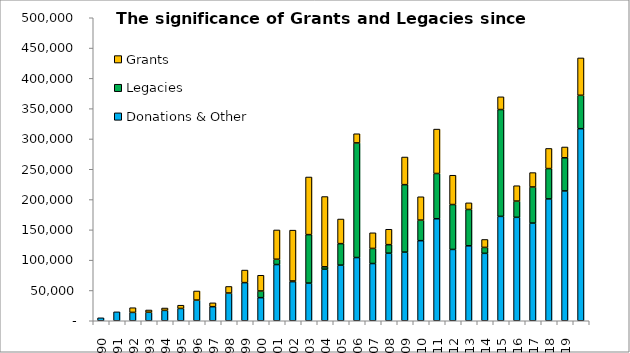
| Category | Donations & Other Income  | Legacies  | Grants |
|---|---|---|---|
| 1990.0 | 4873 | 0 | 0 |
| 1991.0 | 14704 | 0 | 0 |
| 1992.0 | 13769 | 0 | 7740 |
| 1993.0 | 14069 | 0 | 3720 |
| 1994.0 | 17131 | 0 | 3900 |
| 1995.0 | 20295 | 0 | 5375 |
| 1996.0 | 34104 | 0 | 15025 |
| 1997.0 | 23215 | 0 | 6350 |
| 1998.0 | 45757 | 0 | 10842 |
| 1999.0 | 62913 | 0 | 20752 |
| 2000.0 | 38131 | 11000 | 25959 |
| 2001.0 | 92755 | 8741 | 48350 |
| 2002.0 | 64526 | 1108 | 83906 |
| 2003.0 | 62138 | 80000 | 95075 |
| 2004.0 | 85104 | 3915 | 115954 |
| 2005.0 | 91782 | 35480 | 40619 |
| 2006.0 | 104321 | 189133 | 15133 |
| 2007.0 | 94442 | 24908 | 25804 |
| 2008.0 | 111489 | 14088 | 25425 |
| 2009.0 | 113252 | 111336 | 45602 |
| 2010.0 | 132167 | 33905 | 38548 |
| 2011.0 | 168351 | 74681 | 73248 |
| 2012.0 | 117695 | 74064 | 48367 |
| 2013.0 | 123664 | 59971 | 10950 |
| 2014.0 | 111248 | 9781 | 13100 |
| 2015.0 | 172215 | 176320 | 21000 |
| 2016.0 | 170679 | 26759 | 25400 |
| 2017.0 | 161160 | 59579 | 23750 |
| 2018.0 | 201063 | 50062 | 33225 |
| 2019.0 | 214249 | 54692 | 17825 |